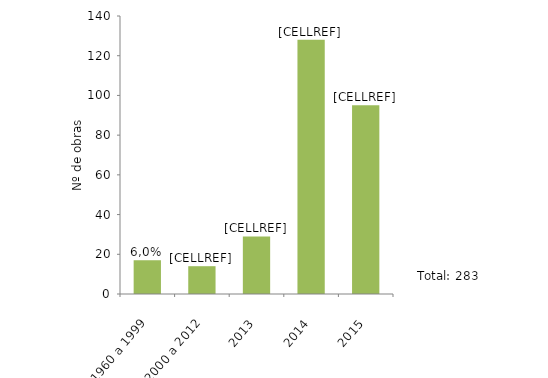
| Category | Series 0 |
|---|---|
| 1960 a 1999 | 17 |
| 2000 a 2012 | 14 |
| 2013 | 29 |
| 2014 | 128 |
| 2015 | 95 |